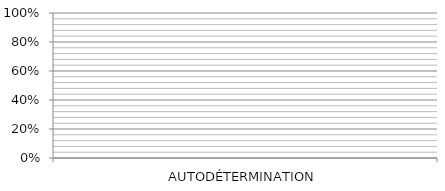
| Category | Series 0 | Series 1 | Series 2 | Series 3 |
|---|---|---|---|---|
| AUTODÉTERMINATION | 0 | 0 | 0 | 0 |